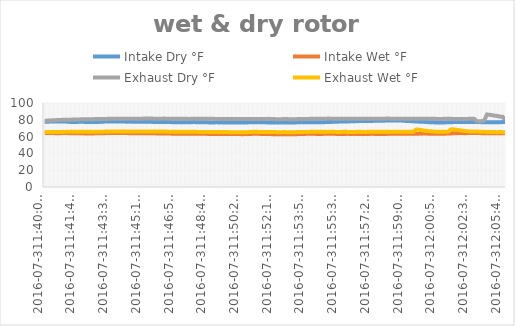
| Category | Intake Dry °F | Intake Wet °F | Exhaust Dry °F | Exhaust Wet °F |
|---|---|---|---|---|
| 2016-07-311:40:03 PM | 77.562 | 64.287 | 78.912 | 65.525 |
| 2016-07-311:40:07 PM | 77.562 | 64.287 | 78.912 | 65.525 |
| 2016-07-311:40:11 PM | 77.675 | 64.175 | 79.025 | 65.412 |
| 2016-07-311:40:15 PM | 77.788 | 64.175 | 79.138 | 65.412 |
| 2016-07-311:40:19 PM | 77.9 | 64.175 | 79.25 | 65.412 |
| 2016-07-311:40:24 PM | 77.9 | 64.175 | 79.25 | 65.412 |
| 2016-07-311:40:28 PM | 77.9 | 64.175 | 79.363 | 65.412 |
| 2016-07-311:40:32 PM | 77.9 | 64.175 | 79.475 | 65.412 |
| 2016-07-311:40:36 PM | 78.012 | 64.062 | 79.588 | 65.412 |
| 2016-07-311:40:40 PM | 78.012 | 64.062 | 79.588 | 65.412 |
| 2016-07-311:40:44 PM | 78.125 | 64.062 | 79.7 | 65.412 |
| 2016-07-311:40:49 PM | 78.125 | 64.062 | 79.812 | 65.412 |
| 2016-07-311:40:53 PM | 78.125 | 64.062 | 79.812 | 65.412 |
| 2016-07-311:40:57 PM | 78.012 | 64.175 | 79.925 | 65.412 |
| 2016-07-311:41:01 PM | 78.012 | 64.175 | 80.038 | 65.525 |
| 2016-07-311:41:05 PM | 78.012 | 64.175 | 80.038 | 65.525 |
| 2016-07-311:41:09 PM | 77.9 | 64.175 | 80.038 | 65.638 |
| 2016-07-311:41:14 PM | 77.788 | 64.175 | 80.038 | 65.638 |
| 2016-07-311:41:18 PM | 77.675 | 64.175 | 80.15 | 65.638 |
| 2016-07-311:41:22 PM | 77.562 | 64.062 | 80.15 | 65.638 |
| 2016-07-311:41:26 PM | 77.45 | 64.062 | 80.15 | 65.638 |
| 2016-07-311:41:30 PM | 77.45 | 63.95 | 80.262 | 65.638 |
| 2016-07-311:41:34 PM | 77.45 | 63.95 | 80.262 | 65.638 |
| 2016-07-311:41:38 PM | 77.338 | 63.95 | 80.375 | 65.638 |
| 2016-07-311:41:43 PM | 77.45 | 63.95 | 80.375 | 65.638 |
| 2016-07-311:41:47 PM | 77.45 | 63.95 | 80.488 | 65.638 |
| 2016-07-311:41:51 PM | 77.562 | 63.95 | 80.488 | 65.638 |
| 2016-07-311:41:55 PM | 77.675 | 63.95 | 80.488 | 65.638 |
| 2016-07-311:41:59 PM | 77.675 | 63.95 | 80.6 | 65.75 |
| 2016-07-311:42:03 PM | 77.562 | 63.95 | 80.6 | 65.638 |
| 2016-07-311:42:08 PM | 77.562 | 63.838 | 80.6 | 65.638 |
| 2016-07-311:42:12 PM | 77.45 | 63.838 | 80.712 | 65.638 |
| 2016-07-311:42:16 PM | 77.338 | 63.838 | 80.712 | 65.638 |
| 2016-07-311:42:20 PM | 77.338 | 63.838 | 80.712 | 65.638 |
| 2016-07-311:42:24 PM | 77.338 | 63.725 | 80.712 | 65.75 |
| 2016-07-311:42:28 PM | 77.338 | 63.838 | 80.712 | 65.75 |
| 2016-07-311:42:33 PM | 77.338 | 63.838 | 80.712 | 65.75 |
| 2016-07-311:42:37 PM | 77.338 | 63.838 | 80.712 | 65.75 |
| 2016-07-311:42:41 PM | 77.338 | 63.838 | 80.825 | 65.75 |
| 2016-07-311:42:45 PM | 77.338 | 63.95 | 80.825 | 65.75 |
| 2016-07-311:42:49 PM | 77.338 | 63.95 | 80.825 | 65.75 |
| 2016-07-311:42:53 PM | 77.45 | 63.95 | 80.825 | 65.638 |
| 2016-07-311:42:58 PM | 77.562 | 63.95 | 80.825 | 65.75 |
| 2016-07-311:43:02 PM | 77.562 | 64.062 | 80.938 | 65.75 |
| 2016-07-311:43:06 PM | 77.675 | 64.062 | 80.938 | 65.75 |
| 2016-07-311:43:10 PM | 77.788 | 64.062 | 81.05 | 65.863 |
| 2016-07-311:43:14 PM | 77.9 | 64.062 | 81.05 | 65.975 |
| 2016-07-311:43:18 PM | 77.9 | 64.175 | 81.05 | 65.975 |
| 2016-07-311:43:23 PM | 78.125 | 64.175 | 81.162 | 65.975 |
| 2016-07-311:43:27 PM | 78.125 | 64.175 | 81.162 | 65.863 |
| 2016-07-311:43:31 PM | 78.125 | 64.175 | 81.162 | 65.975 |
| 2016-07-311:43:35 PM | 78.125 | 64.287 | 81.162 | 65.975 |
| 2016-07-311:43:39 PM | 78.125 | 64.287 | 81.162 | 65.975 |
| 2016-07-311:43:43 PM | 78.125 | 64.175 | 81.162 | 65.975 |
| 2016-07-311:43:47 PM | 78.125 | 64.175 | 81.162 | 66.088 |
| 2016-07-311:43:52 PM | 78.125 | 64.175 | 81.275 | 66.088 |
| 2016-07-311:43:56 PM | 78.125 | 64.287 | 81.275 | 66.088 |
| 2016-07-311:44:00 PM | 78.012 | 64.287 | 81.388 | 66.2 |
| 2016-07-311:44:04 PM | 78.012 | 64.175 | 81.275 | 66.2 |
| 2016-07-311:44:08 PM | 78.012 | 64.175 | 81.275 | 66.088 |
| 2016-07-311:44:12 PM | 77.9 | 64.287 | 81.162 | 66.2 |
| 2016-07-311:44:17 PM | 77.9 | 64.175 | 81.162 | 66.2 |
| 2016-07-311:44:21 PM | 77.788 | 64.175 | 81.162 | 66.088 |
| 2016-07-311:44:25 PM | 77.788 | 64.175 | 81.162 | 66.088 |
| 2016-07-311:44:29 PM | 77.788 | 64.062 | 81.162 | 66.088 |
| 2016-07-311:44:33 PM | 77.9 | 64.062 | 81.162 | 66.088 |
| 2016-07-311:44:38 PM | 77.788 | 64.062 | 81.162 | 66.088 |
| 2016-07-311:44:42 PM | 77.788 | 63.95 | 81.275 | 66.088 |
| 2016-07-311:44:46 PM | 77.788 | 63.95 | 81.388 | 66.088 |
| 2016-07-311:44:50 PM | 77.788 | 63.95 | 81.275 | 66.088 |
| 2016-07-311:44:54 PM | 77.788 | 63.95 | 81.388 | 66.088 |
| 2016-07-311:44:58 PM | 77.788 | 63.95 | 81.388 | 66.2 |
| 2016-07-311:45:02 PM | 77.675 | 63.95 | 81.388 | 66.088 |
| 2016-07-311:45:07 PM | 77.675 | 63.95 | 81.388 | 66.088 |
| 2016-07-311:45:11 PM | 77.562 | 63.95 | 81.388 | 66.088 |
| 2016-07-311:45:15 PM | 77.562 | 63.95 | 81.388 | 66.088 |
| 2016-07-311:45:19 PM | 77.562 | 63.95 | 81.5 | 66.088 |
| 2016-07-311:45:23 PM | 77.562 | 63.838 | 81.5 | 66.2 |
| 2016-07-311:45:27 PM | 77.562 | 63.95 | 81.5 | 66.2 |
| 2016-07-311:45:32 PM | 77.562 | 63.95 | 81.613 | 66.2 |
| 2016-07-311:45:36 PM | 77.562 | 63.95 | 81.5 | 66.2 |
| 2016-07-311:45:40 PM | 77.562 | 63.95 | 81.5 | 66.2 |
| 2016-07-311:45:44 PM | 77.562 | 63.95 | 81.5 | 66.2 |
| 2016-07-311:45:48 PM | 77.45 | 63.95 | 81.388 | 66.2 |
| 2016-07-311:45:52 PM | 77.45 | 63.95 | 81.388 | 66.088 |
| 2016-07-311:45:57 PM | 77.45 | 63.838 | 81.388 | 66.088 |
| 2016-07-311:46:01 PM | 77.45 | 63.838 | 81.275 | 65.975 |
| 2016-07-311:46:05 PM | 77.45 | 63.838 | 81.275 | 65.975 |
| 2016-07-311:46:09 PM | 77.45 | 63.725 | 81.388 | 65.975 |
| 2016-07-311:46:13 PM | 77.338 | 63.725 | 81.388 | 65.975 |
| 2016-07-311:46:17 PM | 77.45 | 63.725 | 81.388 | 65.975 |
| 2016-07-311:46:22 PM | 77.338 | 63.725 | 81.5 | 65.975 |
| 2016-07-311:46:26 PM | 77.338 | 63.725 | 81.388 | 65.975 |
| 2016-07-311:46:30 PM | 77.338 | 63.725 | 81.388 | 65.975 |
| 2016-07-311:46:34 PM | 77.338 | 63.725 | 81.275 | 65.863 |
| 2016-07-311:46:38 PM | 77.338 | 63.612 | 81.275 | 65.863 |
| 2016-07-311:46:42 PM | 77.338 | 63.612 | 81.275 | 65.75 |
| 2016-07-311:46:46 PM | 77.225 | 63.5 | 81.275 | 65.75 |
| 2016-07-311:46:51 PM | 77.225 | 63.5 | 81.162 | 65.75 |
| 2016-07-311:46:55 PM | 77.225 | 63.5 | 81.162 | 65.75 |
| 2016-07-311:46:59 PM | 77.225 | 63.5 | 81.162 | 65.638 |
| 2016-07-311:47:03 PM | 77.225 | 63.5 | 81.275 | 65.638 |
| 2016-07-311:47:07 PM | 77.225 | 63.388 | 81.275 | 65.638 |
| 2016-07-311:47:11 PM | 77.225 | 63.5 | 81.275 | 65.75 |
| 2016-07-311:47:16 PM | 77.225 | 63.5 | 81.275 | 65.75 |
| 2016-07-311:47:20 PM | 77.225 | 63.5 | 81.275 | 65.75 |
| 2016-07-311:47:24 PM | 77.225 | 63.388 | 81.275 | 65.75 |
| 2016-07-311:47:28 PM | 77.225 | 63.388 | 81.162 | 65.75 |
| 2016-07-311:47:32 PM | 77.225 | 63.5 | 81.162 | 65.75 |
| 2016-07-311:47:36 PM | 77.225 | 63.5 | 81.162 | 65.75 |
| 2016-07-311:47:41 PM | 77.113 | 63.388 | 81.05 | 65.638 |
| 2016-07-311:47:45 PM | 77.113 | 63.388 | 81.05 | 65.638 |
| 2016-07-311:47:49 PM | 77.113 | 63.275 | 81.162 | 65.638 |
| 2016-07-311:47:53 PM | 77.225 | 63.275 | 81.162 | 65.638 |
| 2016-07-311:47:57 PM | 77.338 | 63.388 | 81.275 | 65.638 |
| 2016-07-311:48:01 PM | 77.225 | 63.388 | 81.275 | 65.638 |
| 2016-07-311:48:06 PM | 77.225 | 63.388 | 81.162 | 65.638 |
| 2016-07-311:48:10 PM | 77.225 | 63.388 | 81.275 | 65.638 |
| 2016-07-311:48:14 PM | 77.225 | 63.275 | 81.275 | 65.525 |
| 2016-07-311:48:18 PM | 77.225 | 63.275 | 81.275 | 65.525 |
| 2016-07-311:48:22 PM | 77.225 | 63.275 | 81.275 | 65.525 |
| 2016-07-311:48:26 PM | 77.225 | 63.275 | 81.275 | 65.525 |
| 2016-07-311:48:30 PM | 77.225 | 63.275 | 81.162 | 65.525 |
| 2016-07-311:48:35 PM | 77.113 | 63.275 | 81.275 | 65.525 |
| 2016-07-311:48:39 PM | 77 | 63.275 | 81.275 | 65.525 |
| 2016-07-311:48:43 PM | 76.888 | 63.162 | 81.275 | 65.525 |
| 2016-07-311:48:47 PM | 76.888 | 63.162 | 81.275 | 65.638 |
| 2016-07-311:48:51 PM | 76.888 | 63.05 | 81.162 | 65.525 |
| 2016-07-311:48:55 PM | 76.888 | 63.162 | 81.162 | 65.525 |
| 2016-07-311:49:00 PM | 76.888 | 63.162 | 81.162 | 65.525 |
| 2016-07-311:49:04 PM | 76.888 | 63.162 | 81.05 | 65.525 |
| 2016-07-311:49:08 PM | 77 | 63.162 | 81.05 | 65.525 |
| 2016-07-311:49:12 PM | 77 | 63.162 | 81.05 | 65.525 |
| 2016-07-311:49:16 PM | 76.888 | 63.275 | 81.05 | 65.412 |
| 2016-07-311:49:20 PM | 76.888 | 63.162 | 81.05 | 65.412 |
| 2016-07-311:49:24 PM | 77 | 63.162 | 81.05 | 65.412 |
| 2016-07-311:49:29 PM | 76.888 | 63.162 | 81.05 | 65.412 |
| 2016-07-311:49:33 PM | 76.888 | 63.05 | 81.05 | 65.412 |
| 2016-07-311:49:37 PM | 76.888 | 63.162 | 81.05 | 65.412 |
| 2016-07-311:49:41 PM | 76.888 | 63.05 | 80.938 | 65.412 |
| 2016-07-311:49:45 PM | 76.888 | 63.05 | 80.938 | 65.412 |
| 2016-07-311:49:49 PM | 76.888 | 63.05 | 80.938 | 65.3 |
| 2016-07-311:49:54 PM | 76.888 | 63.05 | 80.938 | 65.3 |
| 2016-07-311:49:58 PM | 76.888 | 63.05 | 80.825 | 65.3 |
| 2016-07-311:50:02 PM | 76.888 | 63.05 | 80.825 | 65.3 |
| 2016-07-311:50:06 PM | 76.888 | 63.05 | 80.825 | 65.3 |
| 2016-07-311:50:10 PM | 76.888 | 63.162 | 80.825 | 65.3 |
| 2016-07-311:50:14 PM | 76.775 | 63.05 | 80.825 | 65.3 |
| 2016-07-311:50:19 PM | 76.775 | 63.05 | 80.825 | 65.3 |
| 2016-07-311:50:23 PM | 76.775 | 63.05 | 80.938 | 65.3 |
| 2016-07-311:50:27 PM | 76.775 | 62.938 | 80.825 | 65.3 |
| 2016-07-311:50:31 PM | 76.775 | 62.938 | 80.825 | 65.3 |
| 2016-07-311:50:35 PM | 76.775 | 62.938 | 80.825 | 65.3 |
| 2016-07-311:50:39 PM | 76.775 | 63.05 | 80.825 | 65.3 |
| 2016-07-311:50:43 PM | 76.888 | 62.938 | 80.825 | 65.3 |
| 2016-07-311:50:48 PM | 76.888 | 63.05 | 80.825 | 65.3 |
| 2016-07-311:50:52 PM | 77 | 63.05 | 80.825 | 65.412 |
| 2016-07-311:50:56 PM | 77 | 63.162 | 80.825 | 65.412 |
| 2016-07-311:51:00 PM | 77.113 | 63.162 | 80.938 | 65.525 |
| 2016-07-311:51:04 PM | 77.113 | 63.388 | 80.938 | 65.638 |
| 2016-07-311:51:08 PM | 77.113 | 63.275 | 81.05 | 65.638 |
| 2016-07-311:51:13 PM | 77.113 | 63.275 | 81.05 | 65.638 |
| 2016-07-311:51:17 PM | 77.113 | 63.275 | 81.05 | 65.638 |
| 2016-07-311:51:21 PM | 77.113 | 63.275 | 81.05 | 65.638 |
| 2016-07-311:51:25 PM | 77 | 63.275 | 81.05 | 65.525 |
| 2016-07-311:51:29 PM | 77.113 | 63.162 | 81.05 | 65.525 |
| 2016-07-311:51:33 PM | 77 | 63.162 | 81.05 | 65.525 |
| 2016-07-311:51:37 PM | 77 | 63.162 | 81.05 | 65.525 |
| 2016-07-311:51:42 PM | 77 | 63.162 | 81.05 | 65.525 |
| 2016-07-311:51:46 PM | 77 | 63.05 | 81.05 | 65.525 |
| 2016-07-311:51:50 PM | 76.888 | 63.05 | 81.05 | 65.525 |
| 2016-07-311:51:54 PM | 76.888 | 63.05 | 81.162 | 65.525 |
| 2016-07-311:51:58 PM | 76.888 | 63.05 | 81.05 | 65.525 |
| 2016-07-311:52:02 PM | 76.775 | 62.938 | 80.938 | 65.525 |
| 2016-07-311:52:07 PM | 76.775 | 62.938 | 80.938 | 65.412 |
| 2016-07-311:52:11 PM | 76.775 | 62.938 | 80.825 | 65.412 |
| 2016-07-311:52:15 PM | 76.775 | 62.825 | 80.825 | 65.412 |
| 2016-07-311:52:19 PM | 76.775 | 62.938 | 80.712 | 65.3 |
| 2016-07-311:52:23 PM | 76.775 | 62.825 | 80.712 | 65.3 |
| 2016-07-311:52:27 PM | 76.775 | 62.825 | 80.712 | 65.3 |
| 2016-07-311:52:32 PM | 76.775 | 62.825 | 80.712 | 65.3 |
| 2016-07-311:52:36 PM | 76.775 | 62.825 | 80.712 | 65.3 |
| 2016-07-311:52:40 PM | 76.888 | 62.825 | 80.825 | 65.3 |
| 2016-07-311:52:44 PM | 76.888 | 62.825 | 80.825 | 65.412 |
| 2016-07-311:52:48 PM | 76.888 | 62.938 | 80.825 | 65.3 |
| 2016-07-311:52:52 PM | 76.888 | 62.938 | 80.825 | 65.3 |
| 2016-07-311:52:57 PM | 76.888 | 62.938 | 80.825 | 65.3 |
| 2016-07-311:53:01 PM | 76.888 | 62.938 | 80.712 | 65.3 |
| 2016-07-311:53:05 PM | 76.775 | 62.825 | 80.712 | 65.3 |
| 2016-07-311:53:09 PM | 76.775 | 62.825 | 80.712 | 65.3 |
| 2016-07-311:53:13 PM | 76.775 | 62.938 | 80.712 | 65.3 |
| 2016-07-311:53:17 PM | 76.888 | 62.938 | 80.712 | 65.3 |
| 2016-07-311:53:22 PM | 76.888 | 62.938 | 80.712 | 65.3 |
| 2016-07-311:53:26 PM | 77 | 62.938 | 80.825 | 65.412 |
| 2016-07-311:53:30 PM | 77 | 63.05 | 80.938 | 65.412 |
| 2016-07-311:53:34 PM | 77.113 | 63.05 | 80.938 | 65.525 |
| 2016-07-311:53:38 PM | 77.113 | 63.162 | 80.938 | 65.525 |
| 2016-07-311:53:42 PM | 77.225 | 63.162 | 80.938 | 65.525 |
| 2016-07-311:53:46 PM | 77.225 | 63.162 | 81.05 | 65.525 |
| 2016-07-311:53:51 PM | 77.225 | 63.162 | 81.05 | 65.525 |
| 2016-07-311:53:55 PM | 77.225 | 63.275 | 81.05 | 65.525 |
| 2016-07-311:53:59 PM | 77.225 | 63.275 | 81.05 | 65.638 |
| 2016-07-311:54:03 PM | 77.225 | 63.275 | 81.05 | 65.525 |
| 2016-07-311:54:07 PM | 77.225 | 63.275 | 81.162 | 65.638 |
| 2016-07-311:54:11 PM | 77.225 | 63.275 | 81.275 | 65.638 |
| 2016-07-311:54:15 PM | 77.225 | 63.275 | 81.275 | 65.75 |
| 2016-07-311:54:19 PM | 77.225 | 63.275 | 81.275 | 65.638 |
| 2016-07-311:54:23 PM | 77.225 | 63.275 | 81.275 | 65.638 |
| 2016-07-311:54:27 PM | 77.113 | 63.162 | 81.275 | 65.638 |
| 2016-07-311:54:32 PM | 77.113 | 63.162 | 81.275 | 65.638 |
| 2016-07-311:54:36 PM | 77.113 | 63.162 | 81.275 | 65.638 |
| 2016-07-311:54:40 PM | 77.113 | 63.162 | 81.275 | 65.638 |
| 2016-07-311:54:44 PM | 77.113 | 63.162 | 81.275 | 65.638 |
| 2016-07-311:54:48 PM | 77.225 | 63.275 | 81.275 | 65.638 |
| 2016-07-311:54:53 PM | 77.225 | 63.275 | 81.388 | 65.638 |
| 2016-07-311:54:57 PM | 77.338 | 63.388 | 81.388 | 65.75 |
| 2016-07-311:55:01 PM | 77.338 | 63.275 | 81.388 | 65.75 |
| 2016-07-311:55:05 PM | 77.338 | 63.275 | 81.5 | 65.75 |
| 2016-07-311:55:09 PM | 77.45 | 63.275 | 81.388 | 65.75 |
| 2016-07-311:55:13 PM | 77.45 | 63.275 | 81.388 | 65.75 |
| 2016-07-311:55:18 PM | 77.562 | 63.275 | 81.388 | 65.638 |
| 2016-07-311:55:22 PM | 77.675 | 63.275 | 81.275 | 65.638 |
| 2016-07-311:55:26 PM | 77.675 | 63.275 | 81.275 | 65.638 |
| 2016-07-311:55:30 PM | 77.788 | 63.162 | 81.275 | 65.525 |
| 2016-07-311:55:34 PM | 77.788 | 63.162 | 81.275 | 65.525 |
| 2016-07-311:55:39 PM | 77.9 | 63.162 | 81.275 | 65.525 |
| 2016-07-311:55:43 PM | 77.9 | 63.162 | 81.275 | 65.525 |
| 2016-07-311:55:47 PM | 77.9 | 63.162 | 81.275 | 65.638 |
| 2016-07-311:55:51 PM | 77.9 | 63.162 | 81.275 | 65.638 |
| 2016-07-311:55:55 PM | 77.9 | 63.162 | 81.275 | 65.638 |
| 2016-07-311:56:00 PM | 78.012 | 63.162 | 81.275 | 65.638 |
| 2016-07-311:56:04 PM | 78.012 | 63.275 | 81.275 | 65.638 |
| 2016-07-311:56:08 PM | 78.012 | 63.275 | 81.275 | 65.525 |
| 2016-07-311:56:12 PM | 78.125 | 63.162 | 81.275 | 65.525 |
| 2016-07-311:56:17 PM | 78.238 | 63.162 | 81.275 | 65.525 |
| 2016-07-311:56:21 PM | 78.238 | 63.162 | 81.275 | 65.525 |
| 2016-07-311:56:25 PM | 78.238 | 63.275 | 81.275 | 65.525 |
| 2016-07-311:56:29 PM | 78.35 | 63.162 | 81.275 | 65.525 |
| 2016-07-311:56:34 PM | 78.462 | 63.162 | 81.275 | 65.638 |
| 2016-07-311:56:38 PM | 78.35 | 63.05 | 81.275 | 65.638 |
| 2016-07-311:56:42 PM | 78.462 | 63.05 | 81.275 | 65.638 |
| 2016-07-311:56:46 PM | 78.462 | 63.05 | 81.275 | 65.638 |
| 2016-07-311:56:51 PM | 78.462 | 63.05 | 81.162 | 65.638 |
| 2016-07-311:56:55 PM | 78.575 | 63.05 | 81.162 | 65.525 |
| 2016-07-311:56:59 PM | 78.575 | 62.938 | 81.162 | 65.638 |
| 2016-07-311:57:03 PM | 78.575 | 63.05 | 81.162 | 65.525 |
| 2016-07-311:57:07 PM | 78.688 | 63.05 | 81.162 | 65.638 |
| 2016-07-311:57:11 PM | 78.688 | 63.05 | 81.162 | 65.638 |
| 2016-07-311:57:15 PM | 78.688 | 63.162 | 81.162 | 65.638 |
| 2016-07-311:57:20 PM | 78.688 | 63.275 | 81.162 | 65.75 |
| 2016-07-311:57:24 PM | 78.688 | 63.275 | 81.275 | 65.75 |
| 2016-07-311:57:28 PM | 78.688 | 63.275 | 81.275 | 65.638 |
| 2016-07-311:57:32 PM | 78.8 | 63.162 | 81.275 | 65.75 |
| 2016-07-311:57:36 PM | 78.8 | 63.162 | 81.275 | 65.75 |
| 2016-07-311:57:40 PM | 78.8 | 63.162 | 81.275 | 65.75 |
| 2016-07-311:57:44 PM | 78.912 | 63.162 | 81.275 | 65.75 |
| 2016-07-311:57:49 PM | 78.8 | 63.162 | 81.275 | 65.638 |
| 2016-07-311:57:53 PM | 78.912 | 63.162 | 81.275 | 65.638 |
| 2016-07-311:57:57 PM | 78.912 | 63.162 | 81.275 | 65.75 |
| 2016-07-311:58:01 PM | 78.912 | 63.162 | 81.275 | 65.75 |
| 2016-07-311:58:05 PM | 79.025 | 63.162 | 81.388 | 65.75 |
| 2016-07-311:58:09 PM | 79.025 | 63.162 | 81.5 | 65.863 |
| 2016-07-311:58:14 PM | 79.025 | 63.275 | 81.5 | 65.75 |
| 2016-07-311:58:18 PM | 79.025 | 63.275 | 81.5 | 65.863 |
| 2016-07-311:58:22 PM | 79.025 | 63.275 | 81.388 | 65.863 |
| 2016-07-311:58:26 PM | 79.025 | 63.275 | 81.388 | 65.75 |
| 2016-07-311:58:30 PM | 79.025 | 63.275 | 81.388 | 65.75 |
| 2016-07-311:58:34 PM | 79.025 | 63.388 | 81.275 | 65.75 |
| 2016-07-311:58:39 PM | 79.025 | 63.388 | 81.275 | 65.75 |
| 2016-07-311:58:43 PM | 79.138 | 63.388 | 81.275 | 65.75 |
| 2016-07-311:58:47 PM | 79.138 | 63.388 | 81.275 | 65.75 |
| 2016-07-311:58:51 PM | 79.138 | 63.388 | 81.275 | 65.75 |
| 2016-07-311:58:55 PM | 79.138 | 63.388 | 81.388 | 65.863 |
| 2016-07-311:58:59 PM | 79.025 | 63.275 | 81.388 | 65.863 |
| 2016-07-311:59:04 PM | 78.912 | 63.388 | 81.388 | 65.863 |
| 2016-07-311:59:08 PM | 78.8 | 63.388 | 81.275 | 65.863 |
| 2016-07-311:59:12 PM | 78.688 | 63.388 | 81.388 | 65.863 |
| 2016-07-311:59:16 PM | 78.575 | 63.388 | 81.275 | 65.863 |
| 2016-07-311:59:20 PM | 78.462 | 63.388 | 81.275 | 65.863 |
| 2016-07-311:59:24 PM | 78.462 | 63.5 | 81.275 | 65.863 |
| 2016-07-311:59:28 PM | 78.35 | 63.5 | 81.275 | 65.863 |
| 2016-07-311:59:33 PM | 78.238 | 63.5 | 81.275 | 65.863 |
| 2016-07-311:59:37 PM | 78.125 | 63.5 | 81.275 | 65.975 |
| 2016-07-311:59:41 PM | 78.012 | 63.388 | 81.275 | 67.438 |
| 2016-07-311:59:45 PM | 77.9 | 63.5 | 81.388 | 68.45 |
| 2016-07-311:59:49 PM | 77.9 | 63.5 | 81.388 | 68.45 |
| 2016-07-311:59:53 PM | 77.788 | 63.5 | 81.388 | 68.225 |
| 2016-07-311:59:58 PM | 77.788 | 63.612 | 81.388 | 68 |
| 2016-07-312:00:02 PM | 77.675 | 63.5 | 81.388 | 67.662 |
| 2016-07-312:00:06 PM | 77.675 | 63.612 | 81.388 | 67.438 |
| 2016-07-312:00:10 PM | 77.562 | 63.612 | 81.388 | 67.1 |
| 2016-07-312:00:14 PM | 77.45 | 63.612 | 81.275 | 66.988 |
| 2016-07-312:00:18 PM | 77.45 | 63.612 | 81.275 | 66.762 |
| 2016-07-312:00:23 PM | 77.225 | 63.5 | 81.275 | 66.538 |
| 2016-07-312:00:27 PM | 77.225 | 63.5 | 81.275 | 66.425 |
| 2016-07-312:00:31 PM | 77 | 63.5 | 81.275 | 66.312 |
| 2016-07-312:00:35 PM | 77 | 63.388 | 81.162 | 66.2 |
| 2016-07-312:00:39 PM | 77 | 63.388 | 81.162 | 66.088 |
| 2016-07-312:00:43 PM | 76.888 | 63.388 | 81.162 | 65.975 |
| 2016-07-312:00:47 PM | 76.775 | 63.388 | 81.05 | 65.863 |
| 2016-07-312:00:52 PM | 76.775 | 63.388 | 81.05 | 65.75 |
| 2016-07-312:00:56 PM | 76.662 | 63.388 | 81.05 | 65.638 |
| 2016-07-312:01:00 PM | 76.775 | 63.388 | 81.05 | 65.638 |
| 2016-07-312:01:04 PM | 76.662 | 63.388 | 81.05 | 65.638 |
| 2016-07-312:01:08 PM | 76.888 | 63.388 | 81.05 | 65.638 |
| 2016-07-312:01:12 PM | 76.888 | 63.5 | 81.162 | 65.638 |
| 2016-07-312:01:17 PM | 76.888 | 63.5 | 81.162 | 65.638 |
| 2016-07-312:01:21 PM | 77 | 63.612 | 81.162 | 65.638 |
| 2016-07-312:01:25 PM | 77.113 | 63.725 | 81.162 | 65.75 |
| 2016-07-312:01:29 PM | 77.113 | 63.725 | 81.162 | 66.425 |
| 2016-07-312:01:33 PM | 77.113 | 63.838 | 81.162 | 68.338 |
| 2016-07-312:01:37 PM | 77.225 | 63.838 | 81.05 | 68.675 |
| 2016-07-312:01:41 PM | 77.225 | 63.95 | 80.938 | 68.675 |
| 2016-07-312:01:46 PM | 77.338 | 64.062 | 80.938 | 68.45 |
| 2016-07-312:01:50 PM | 77.338 | 64.062 | 80.938 | 68.225 |
| 2016-07-312:01:54 PM | 77.338 | 64.062 | 80.938 | 68 |
| 2016-07-312:01:58 PM | 77.338 | 64.062 | 80.938 | 67.775 |
| 2016-07-312:02:02 PM | 77.45 | 64.175 | 81.05 | 67.55 |
| 2016-07-312:02:06 PM | 77.338 | 64.175 | 81.05 | 67.325 |
| 2016-07-312:02:11 PM | 77.338 | 64.062 | 80.938 | 67.1 |
| 2016-07-312:02:15 PM | 77.338 | 64.175 | 81.05 | 66.875 |
| 2016-07-312:02:19 PM | 77.45 | 64.062 | 81.05 | 66.65 |
| 2016-07-312:02:23 PM | 77.45 | 64.062 | 81.05 | 66.538 |
| 2016-07-312:02:27 PM | 77.45 | 64.175 | 81.05 | 66.312 |
| 2016-07-312:02:31 PM | 77.45 | 64.175 | 81.162 | 66.2 |
| 2016-07-312:02:36 PM | 77.45 | 64.175 | 81.162 | 66.088 |
| 2016-07-312:02:40 PM | 77.45 | 64.175 | 81.162 | 65.975 |
| 2016-07-312:02:44 PM | 77.45 | 64.175 | 81.275 | 65.975 |
| 2016-07-312:02:48 PM | 77.45 | 64.175 | 81.275 | 65.975 |
| 2016-07-312:02:52 PM | 77.45 | 64.175 | 80.262 | 65.975 |
| 2016-07-312:02:56 PM | 77.45 | 64.175 | 78.688 | 65.975 |
| 2016-07-312:03:00 PM | 77.338 | 64.175 | 78.238 | 65.975 |
| 2016-07-312:03:05 PM | 77.338 | 64.175 | 78.125 | 65.863 |
| 2016-07-312:03:09 PM | 77.225 | 64.175 | 78.238 | 65.75 |
| 2016-07-312:03:13 PM | 77.225 | 64.062 | 78.462 | 65.75 |
| 2016-07-312:03:17 PM | 77.225 | 64.062 | 78.8 | 65.638 |
| 2016-07-312:03:21 PM | 77.225 | 64.062 | 79.25 | 65.638 |
| 2016-07-312:03:25 PM | 77.225 | 64.062 | 83.075 | 65.638 |
| 2016-07-312:03:30 PM | 77.225 | 64.175 | 86.338 | 65.525 |
| 2016-07-312:03:34 PM | 77.225 | 64.062 | 86.113 | 65.638 |
| 2016-07-312:03:38 PM | 77.113 | 64.062 | 86 | 65.525 |
| 2016-07-312:03:42 PM | 77.113 | 63.95 | 85.662 | 65.525 |
| 2016-07-312:03:46 PM | 77.113 | 63.95 | 85.438 | 65.412 |
| 2016-07-312:03:50 PM | 77.113 | 63.95 | 85.1 | 65.412 |
| 2016-07-312:03:54 PM | 77.113 | 63.95 | 84.875 | 65.412 |
| 2016-07-312:03:59 PM | 77.113 | 63.95 | 84.762 | 65.3 |
| 2016-07-312:04:03 PM | 77.113 | 63.838 | 84.425 | 65.3 |
| 2016-07-312:04:07 PM | 77 | 63.95 | 84.2 | 65.412 |
| 2016-07-312:04:11 PM | 77.113 | 63.95 | 83.863 | 65.412 |
| 2016-07-312:04:15 PM | 77.113 | 63.95 | 83.638 | 65.525 |
| 2016-07-312:05:47 PM | 77.45 | 63.95 | 83.525 | 65.075 |
| 2016-07-312:05:51 PM | 77.45 | 64.062 | 81.613 | 65.188 |
| 2016-07-312:05:55 PM | 77.45 | 64.062 | 81.725 | 65.188 |